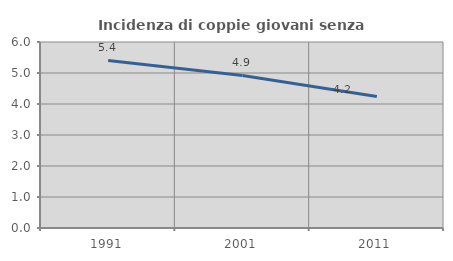
| Category | Incidenza di coppie giovani senza figli |
|---|---|
| 1991.0 | 5.405 |
| 2001.0 | 4.92 |
| 2011.0 | 4.241 |